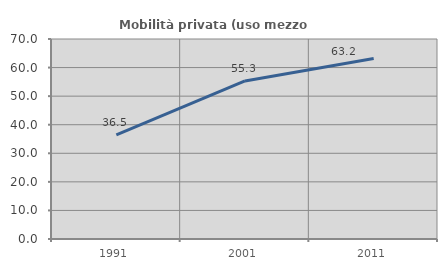
| Category | Mobilità privata (uso mezzo privato) |
|---|---|
| 1991.0 | 36.458 |
| 2001.0 | 55.319 |
| 2011.0 | 63.158 |